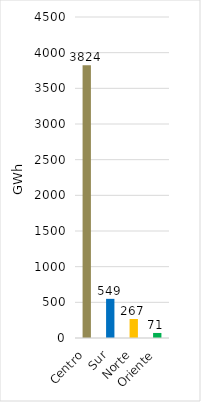
| Category | Series 0 |
|---|---|
| Centro | 3824.115 |
| Sur | 548.899 |
| Norte | 266.55 |
| Oriente | 70.653 |